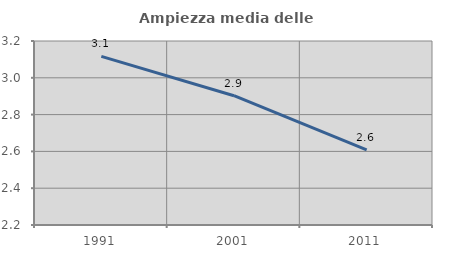
| Category | Ampiezza media delle famiglie |
|---|---|
| 1991.0 | 3.116 |
| 2001.0 | 2.903 |
| 2011.0 | 2.608 |